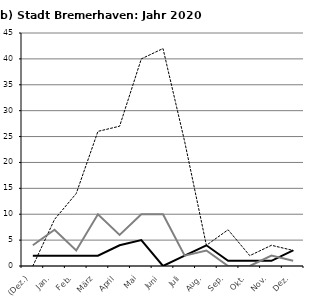
| Category | BHV m Unternehmen | BHV m Verbraucher | BHV m Übrige |
|---|---|---|---|
| (Dez.) | 2 | 0 | 4 |
| Jan. | 2 | 9 | 7 |
| Feb. | 2 | 14 | 3 |
| März | 2 | 26 | 10 |
| April | 4 | 27 | 6 |
| Mai | 5 | 40 | 10 |
| Juni | 0 | 42 | 10 |
| Juli | 2 | 24 | 2 |
| Aug. | 4 | 4 | 3 |
| Sep. | 1 | 7 | 0 |
| Okt. | 1 | 2 | 0 |
| Nov. | 1 | 4 | 2 |
| Dez. | 3 | 3 | 1 |